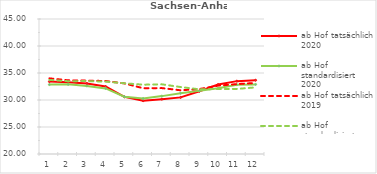
| Category | ab Hof tatsächlich 2020 | ab Hof standardisiert 2020 | ab Hof tatsächlich 2019 | ab Hof standardisiert 2019 |
|---|---|---|---|---|
| 0 | 33.415 | 32.854 | 34.008 | 33.722 |
| 1 | 33.273 | 32.898 | 33.645 | 33.479 |
| 2 | 33.057 | 32.61 | 33.586 | 33.511 |
| 3 | 32.49 | 32.142 | 33.517 | 33.402 |
| 4 | 30.587 | 30.601 | 33.073 | 33.098 |
| 5 | 29.869 | 30.272 | 32.184 | 32.835 |
| 6 | 30.156 | 30.719 | 32.204 | 32.903 |
| 7 | 30.486 | 31.249 | 31.8 | 32.4 |
| 8 | 31.609 | 31.693 | 32.028 | 31.979 |
| 9 | 32.854 | 32.168 | 32.659 | 32.037 |
| 10 | 33.495 | 32.829 | 32.946 | 32.05 |
| 11 | 33.658 | 32.89 | 33.156 | 32.34 |